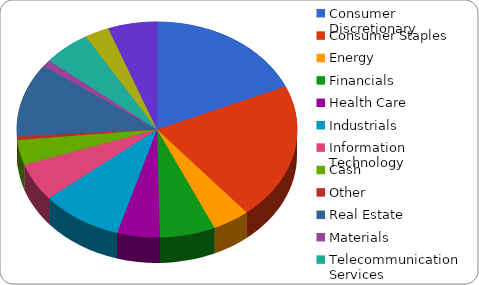
| Category | Series 0 |
|---|---|
| Consumer Discretionary | 45458.133 |
| Consumer Staples | 50630.344 |
| Energy | 10588.2 |
| Financials | 15737.324 |
| Health Care | 12080.884 |
| Industrials | 23163.216 |
| Information Technology | 14093.76 |
| Cash | 9210.02 |
| Other | 1438.281 |
| Real Estate | 27146.794 |
| Materials | 2490.95 |
| Telecommunication Services | 13556.902 |
| Utilities | 6965.848 |
| ETF | 13910.5 |